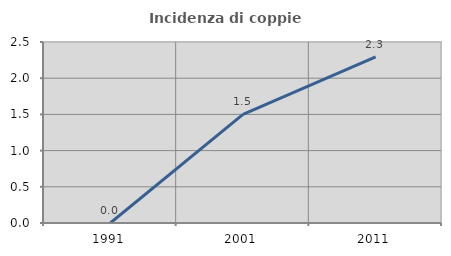
| Category | Incidenza di coppie miste |
|---|---|
| 1991.0 | 0 |
| 2001.0 | 1.502 |
| 2011.0 | 2.296 |